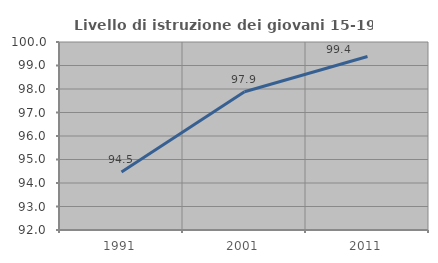
| Category | Livello di istruzione dei giovani 15-19 anni |
|---|---|
| 1991.0 | 94.465 |
| 2001.0 | 97.882 |
| 2011.0 | 99.385 |